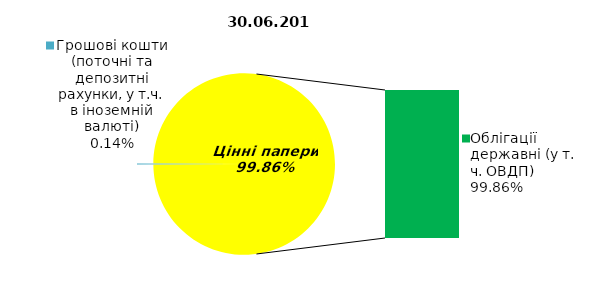
| Category | Series 0 |
|---|---|
| Грошові кошти (поточні та депозитні рахунки, у т.ч. в іноземній валюті) | 0.134 |
| Банківські метали | 0 |
| Нерухомість | 0 |
| Інші активи | 0 |
| Акції | 0 |
| Облігації підприємств | 0 |
| Муніципальні облігації | 0 |
| Облігації державні (у т. ч. ОВДП) | 92.615 |
| Іпотечні сертифікати | 0 |